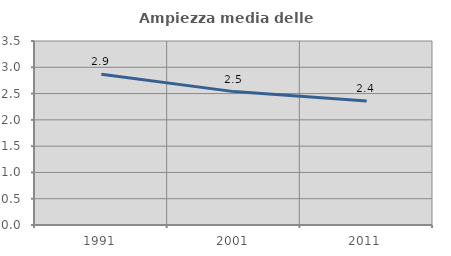
| Category | Ampiezza media delle famiglie |
|---|---|
| 1991.0 | 2.866 |
| 2001.0 | 2.537 |
| 2011.0 | 2.357 |